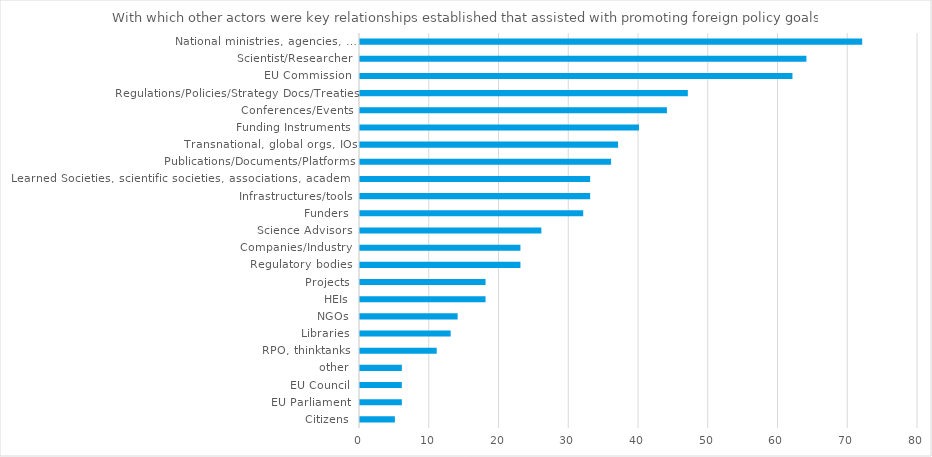
| Category | Series 0 |
|---|---|
| Citizens | 5 |
| EU Parliament | 6 |
| EU Council | 6 |
| other | 6 |
| RPO, thinktanks | 11 |
| Libraries | 13 |
| NGOs | 14 |
| HEIs | 18 |
| Projects | 18 |
| Regulatory bodies | 23 |
| Companies/Industry | 23 |
| Science Advisors | 26 |
| Funders | 32 |
| Infrastructures/tools | 33 |
| Learned Societies, scientific societies, associations, academies | 33 |
| Publications/Documents/Platforms | 36 |
| Transnational, global orgs, IOs | 37 |
| Funding Instruments | 40 |
| Conferences/Events | 44 |
| Regulations/Policies/Strategy Docs/Treaties | 47 |
| EU Commission | 62 |
| Scientist/Researcher | 64 |
| National ministries, agencies, … | 72 |